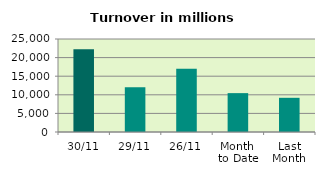
| Category | Series 0 |
|---|---|
| 30/11 | 22252.405 |
| 29/11 | 12022.048 |
| 26/11 | 17011.311 |
| Month 
to Date | 10449.431 |
| Last
Month | 9192.028 |